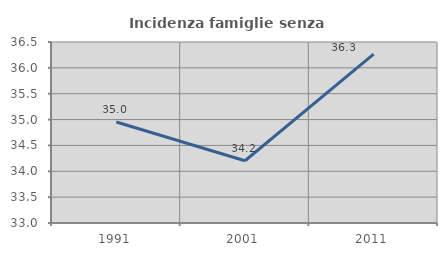
| Category | Incidenza famiglie senza nuclei |
|---|---|
| 1991.0 | 34.954 |
| 2001.0 | 34.204 |
| 2011.0 | 36.264 |